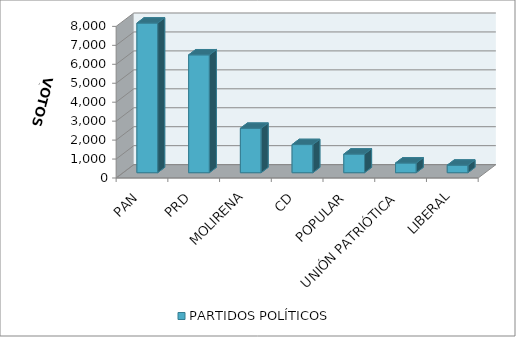
| Category | PARTIDOS POLÍTICOS |
|---|---|
| PAN | 7894 |
| PRD | 6217 |
| MOLIRENA | 2342 |
| CD | 1483 |
| POPULAR | 983 |
| UNIÓN PATRIÓTICA | 511 |
| LIBERAL | 397 |